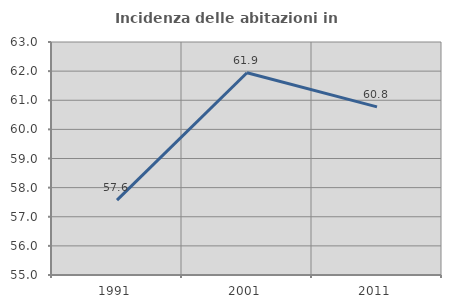
| Category | Incidenza delle abitazioni in proprietà  |
|---|---|
| 1991.0 | 57.573 |
| 2001.0 | 61.942 |
| 2011.0 | 60.772 |